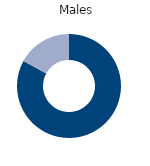
| Category | Males |
|---|---|
| Full-time | 83 |
| Part-time | 17 |